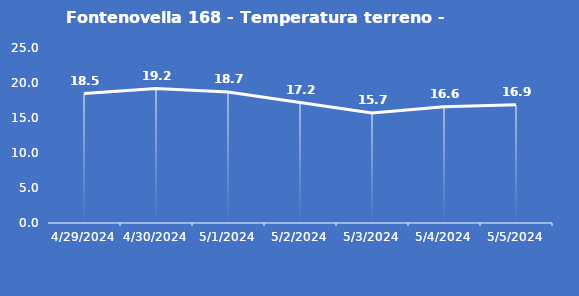
| Category | Fontenovella 168 - Temperatura terreno - Grezzo (°C) |
|---|---|
| 4/29/24 | 18.5 |
| 4/30/24 | 19.2 |
| 5/1/24 | 18.7 |
| 5/2/24 | 17.2 |
| 5/3/24 | 15.7 |
| 5/4/24 | 16.6 |
| 5/5/24 | 16.9 |